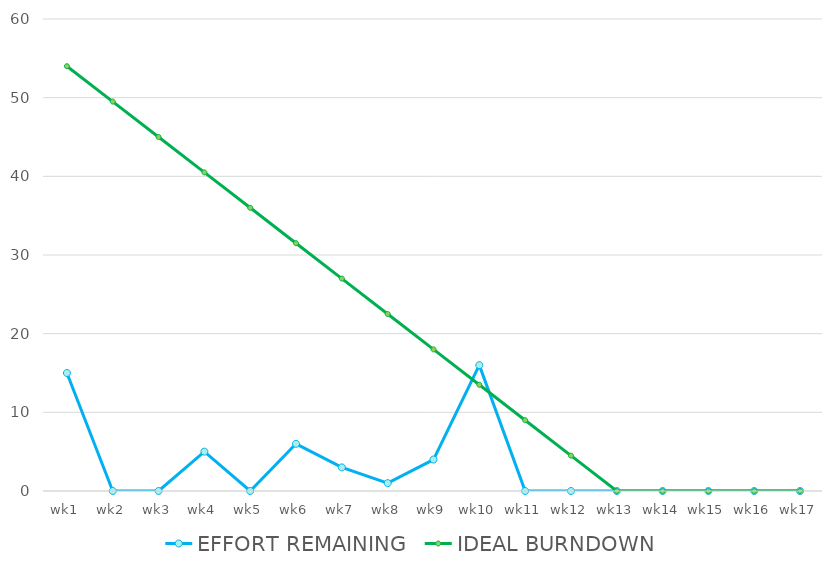
| Category | EFFORT REMAINING | IDEAL BURNDOWN |
|---|---|---|
| wk1 | 15 | 54 |
| wk2 | 0 | 49.5 |
| wk3 | 0 | 45 |
| wk4 | 5 | 40.5 |
| wk5 | 0 | 36 |
| wk6 | 6 | 31.5 |
| wk7 | 3 | 27 |
| wk8 | 1 | 22.5 |
| wk9 | 4 | 18 |
| wk10 | 16 | 13.5 |
| wk11 | 0 | 9 |
| wk12 | 0 | 4.5 |
| wk13 | 0 | 0 |
| wk14 | 0 | 0 |
| wk15 | 0 | 0 |
| wk16 | 0 | 0 |
| wk17 | 0 | 0 |